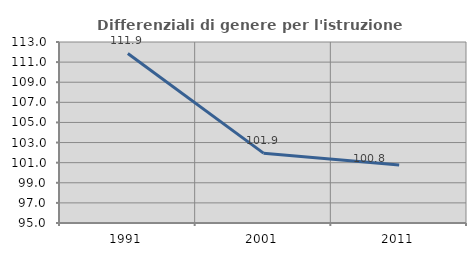
| Category | Differenziali di genere per l'istruzione superiore |
|---|---|
| 1991.0 | 111.86 |
| 2001.0 | 101.948 |
| 2011.0 | 100.766 |